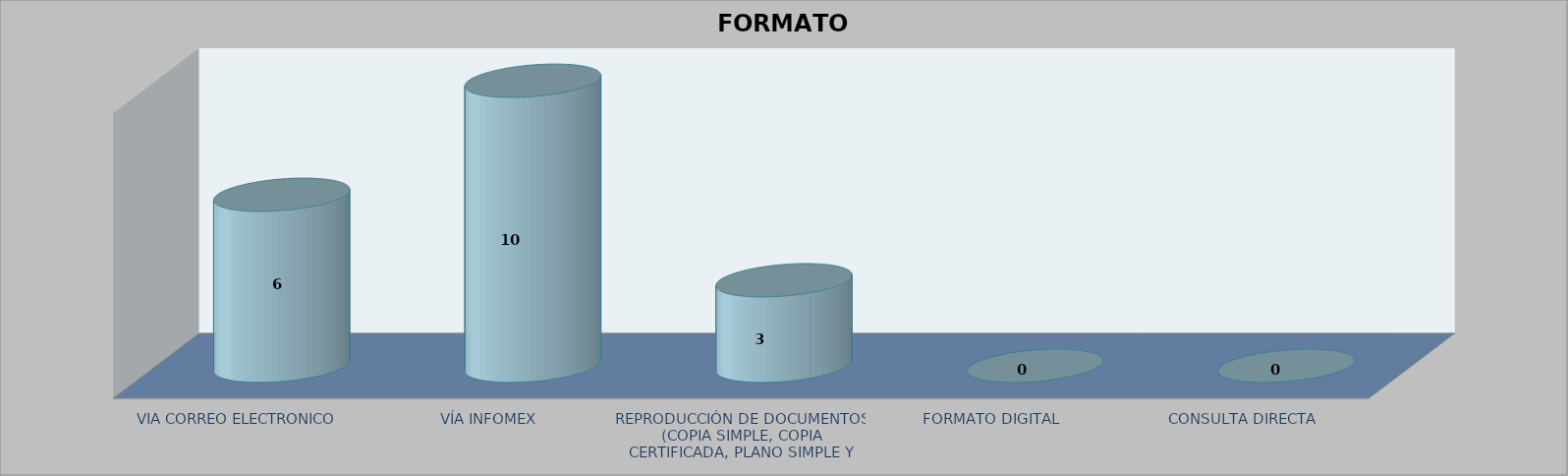
| Category |        FORMATO SOLICITADO | Series 1 | Series 2 |
|---|---|---|---|
| VIA CORREO ELECTRONICO |  |  | 6 |
| VÍA INFOMEX |  |  | 10 |
| REPRODUCCIÓN DE DOCUMENTOS (COPIA SIMPLE, COPIA CERTIFICADA, PLANO SIMPLE Y PLANO CERTIFICADO) |  |  | 3 |
| FORMATO DIGITAL |  |  | 0 |
| CONSULTA DIRECTA |  |  | 0 |